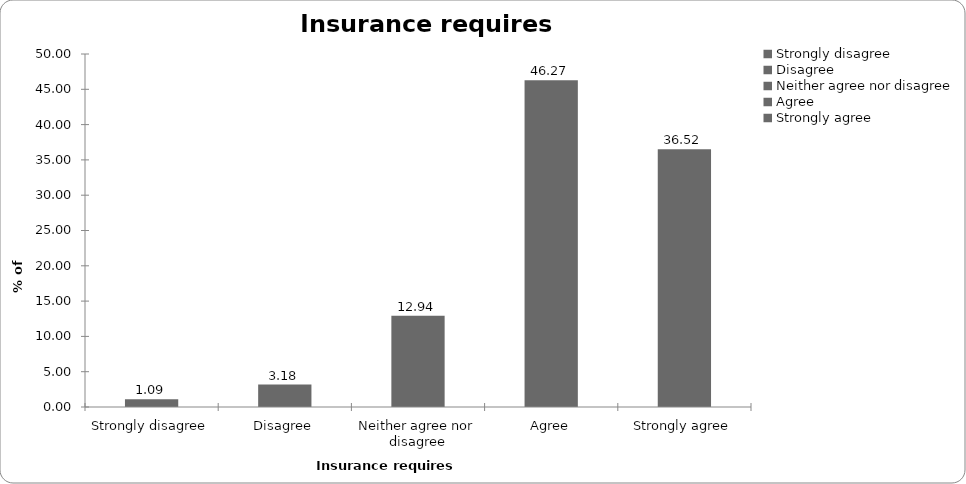
| Category | Insurance requires regulation |
|---|---|
| Strongly disagree | 1.095 |
| Disagree | 3.184 |
| Neither agree nor disagree | 12.935 |
| Agree | 46.269 |
| Strongly agree | 36.517 |